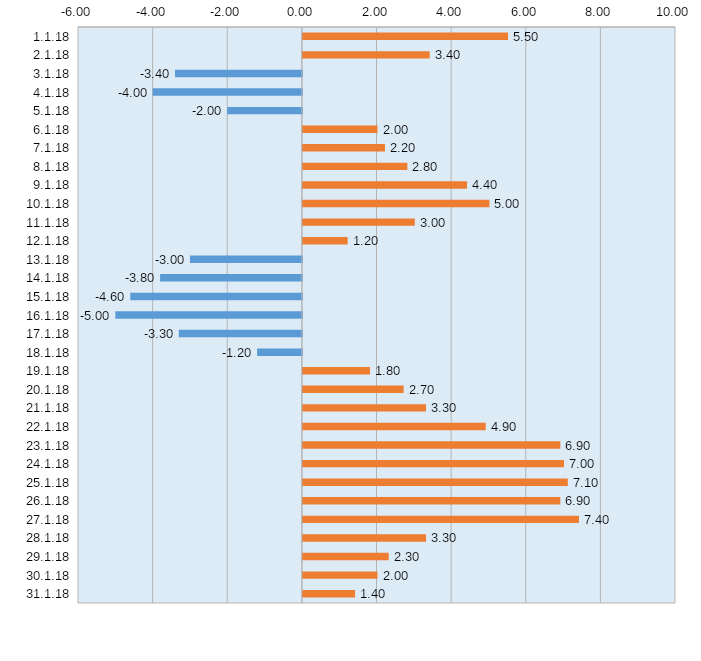
| Category | Series 0 |
|---|---|
| 2018-01-01 | 5.5 |
| 2018-01-02 | 3.4 |
| 2018-01-03 | -3.4 |
| 2018-01-04 | -4 |
| 2018-01-05 | -2 |
| 2018-01-06 | 2 |
| 2018-01-07 | 2.2 |
| 2018-01-08 | 2.8 |
| 2018-01-09 | 4.4 |
| 2018-01-10 | 5 |
| 2018-01-11 | 3 |
| 2018-01-12 | 1.2 |
| 2018-01-13 | -3 |
| 2018-01-14 | -3.8 |
| 2018-01-15 | -4.6 |
| 2018-01-16 | -5 |
| 2018-01-17 | -3.3 |
| 2018-01-18 | -1.2 |
| 2018-01-19 | 1.8 |
| 2018-01-20 | 2.7 |
| 2018-01-21 | 3.3 |
| 2018-01-22 | 4.9 |
| 2018-01-23 | 6.9 |
| 2018-01-24 | 7 |
| 2018-01-25 | 7.1 |
| 2018-01-26 | 6.9 |
| 2018-01-27 | 7.4 |
| 2018-01-28 | 3.3 |
| 2018-01-29 | 2.3 |
| 2018-01-30 | 2 |
| 2018-01-31 | 1.4 |